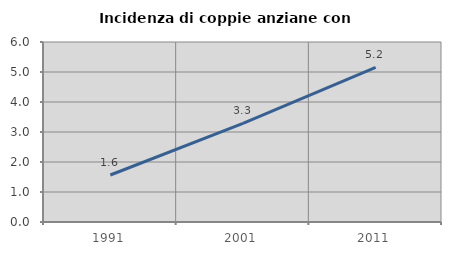
| Category | Incidenza di coppie anziane con figli |
|---|---|
| 1991.0 | 1.567 |
| 2001.0 | 3.289 |
| 2011.0 | 5.152 |